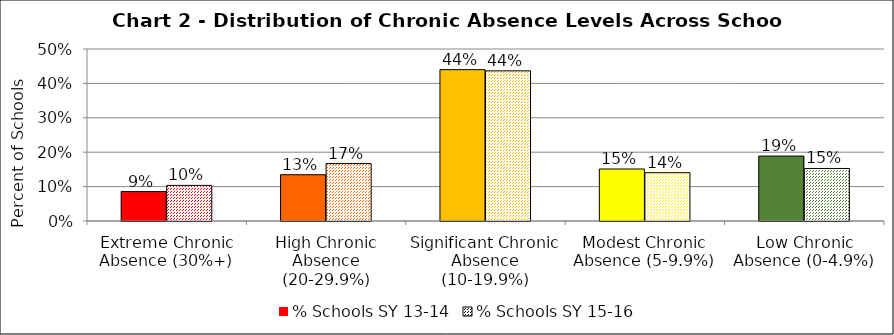
| Category | % Schools SY 13-14 | % Schools SY 15-16 |
|---|---|---|
| Extreme Chronic Absence (30%+) | 0.086 | 0.103 |
| High Chronic Absence (20-29.9%) | 0.135 | 0.167 |
| Significant Chronic Absence (10-19.9%) | 0.44 | 0.436 |
| Modest Chronic Absence (5-9.9%) | 0.151 | 0.14 |
| Low Chronic Absence (0-4.9%) | 0.189 | 0.153 |